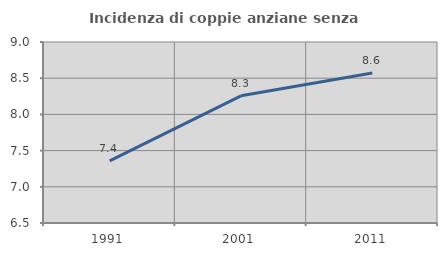
| Category | Incidenza di coppie anziane senza figli  |
|---|---|
| 1991.0 | 7.357 |
| 2001.0 | 8.257 |
| 2011.0 | 8.571 |